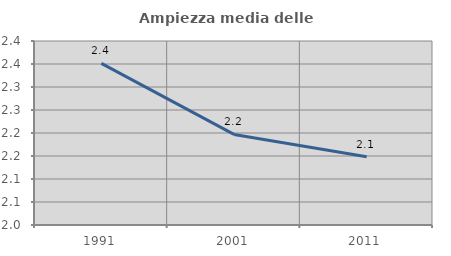
| Category | Ampiezza media delle famiglie |
|---|---|
| 1991.0 | 2.351 |
| 2001.0 | 2.197 |
| 2011.0 | 2.149 |